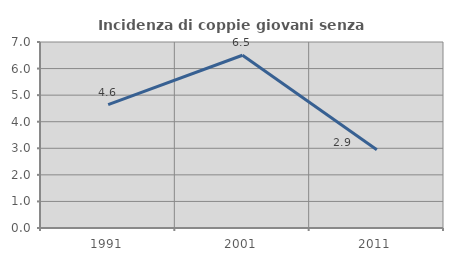
| Category | Incidenza di coppie giovani senza figli |
|---|---|
| 1991.0 | 4.645 |
| 2001.0 | 6.502 |
| 2011.0 | 2.947 |